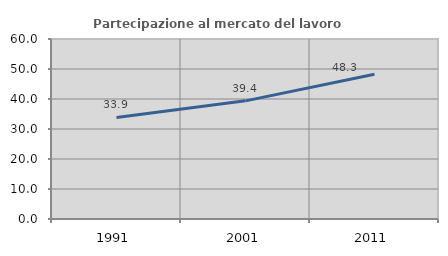
| Category | Partecipazione al mercato del lavoro  femminile |
|---|---|
| 1991.0 | 33.858 |
| 2001.0 | 39.384 |
| 2011.0 | 48.28 |